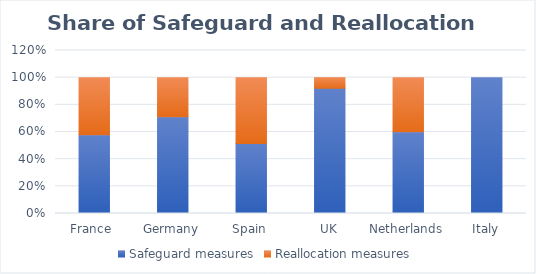
| Category | Safeguard measures | Reallocation measures |
|---|---|---|
| France  | 0.581 | 0.419 |
| Germany | 0.712 | 0.288 |
| Spain | 0.515 | 0.485 |
| UK | 0.922 | 0.078 |
| Netherlands | 0.602 | 0.398 |
| Italy | 1 | 0 |